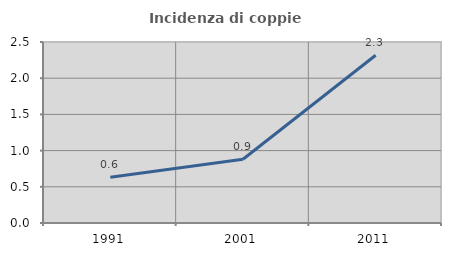
| Category | Incidenza di coppie miste |
|---|---|
| 1991.0 | 0.631 |
| 2001.0 | 0.881 |
| 2011.0 | 2.317 |